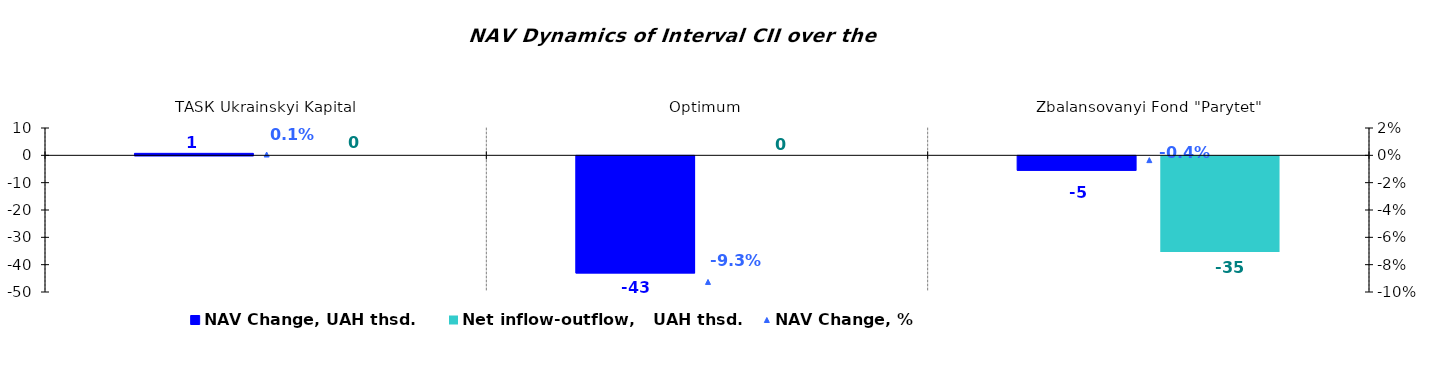
| Category | NAV Change, UAH thsd. | Net inflow-outflow,   UAH thsd. |
|---|---|---|
| ТАSК Ukrainskyi Kapital | 0.727 | 0 |
| Оptimum | -42.845 | 0 |
| Zbalansovanyi Fond "Parytet" | -5.3 | -34.995 |